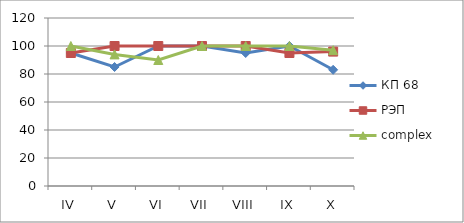
| Category | КП 68 | РЭП  | complex |
|---|---|---|---|
| IV | 95 | 95 | 100 |
| V | 85 | 100 | 94 |
| VI | 100 | 100 | 90 |
| VII | 100 | 100 | 100 |
| VIII | 95 | 100 | 100 |
| IX | 100 | 95 | 100 |
| X | 83 | 96 | 97 |